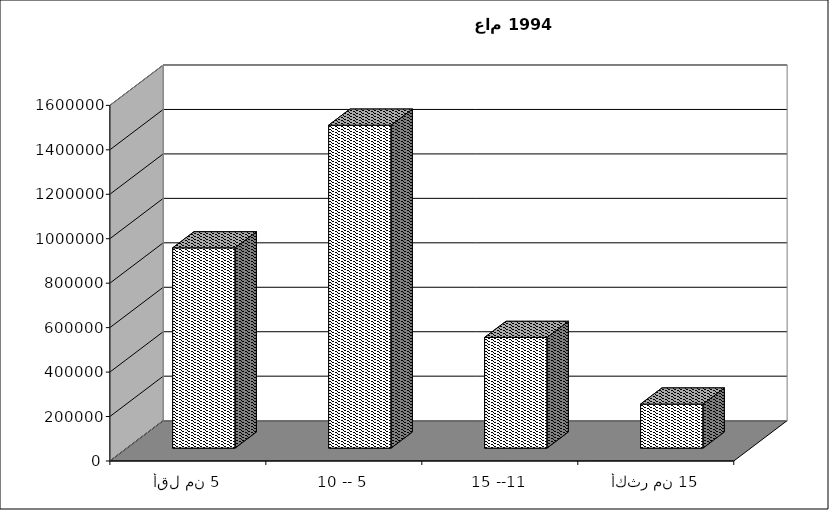
| Category | Series 0 |
|---|---|
| أقل من 5 | 900799 |
| 10 -- 5 | 1452651 |
| 15 --11 | 497771 |
| أكثر من 15 | 197920 |